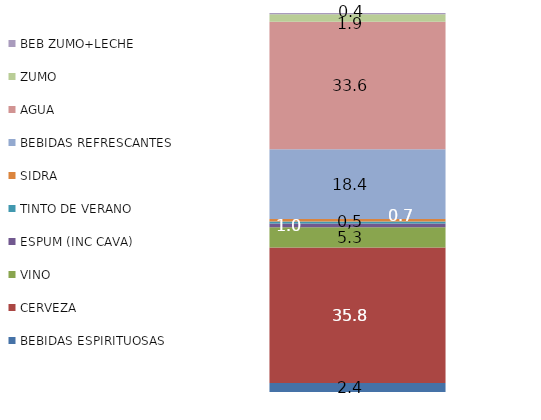
| Category |  BEBIDAS ESPIRITUOSAS  |  CERVEZA  | VINO | ESPUM (INC CAVA) | TINTO DE VERANO | SIDRA |  BEBIDAS REFRESCANTES  |  AGUA  |  ZUMO  |  BEB ZUMO+LECHE  |
|---|---|---|---|---|---|---|---|---|---|---|
| 0 | 2.36 | 35.795 | 5.331 | 0.969 | 0.51 | 0.662 | 18.43 | 33.636 | 1.945 | 0.362 |